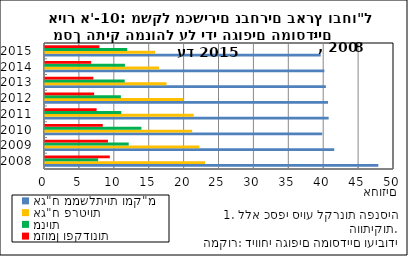
| Category | אג"ח ממשלתיות ומק"מ | אג"ח פרטיות | מניות | מזומן ופקדונות |
|---|---|---|---|---|
| 2008-12-31 | 47.755 | 22.935 | 7.616 | 9.29 |
| 2009-12-31 | 41.438 | 22.127 | 11.995 | 9.02 |
| 2010-12-31 | 39.721 | 21.083 | 13.81 | 8.277 |
| 2011-12-31 | 40.639 | 21.31 | 10.932 | 7.394 |
| 2012-12-31 | 40.543 | 19.837 | 10.873 | 7.04 |
| 2013-12-31 | 40.239 | 17.413 | 11.42 | 6.929 |
| 2014-12-31 | 40.021 | 16.341 | 11.451 | 6.615 |
| 2015-12-31 | 39.5 | 15.774 | 11.781 | 7.794 |